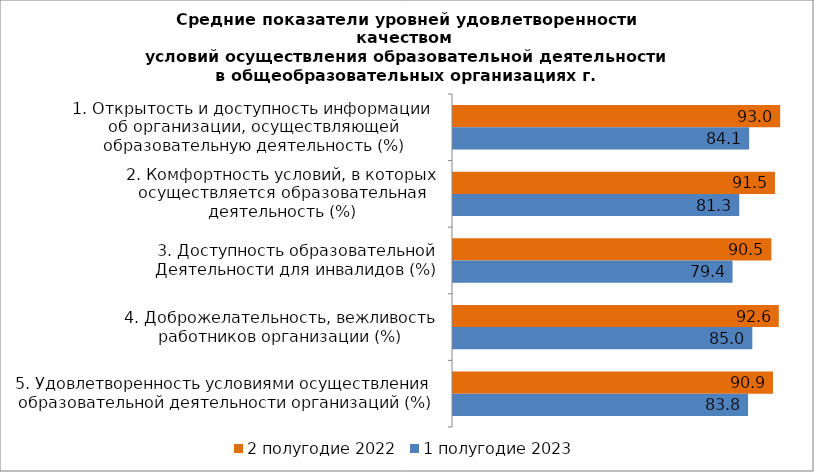
| Category | 2 полугодие 2022 | 1 полугодие 2023 |
|---|---|---|
| 1. Открытость и доступность информации 
об организации, осуществляющей
образовательную деятельность (%) | 92.955 | 84.14 |
| 2. Комфортность условий, в которых
осуществляется образовательная
деятельность (%) | 91.462 | 81.325 |
| 3. Доступность образовательной
Деятельности для инвалидов (%) | 90.464 | 79.42 |
| 4. Доброжелательность, вежливость
работников организации (%) | 92.559 | 85.036 |
| 5. Удовлетворенность условиями осуществления 
образовательной деятельности организаций (%) | 90.898 | 83.819 |